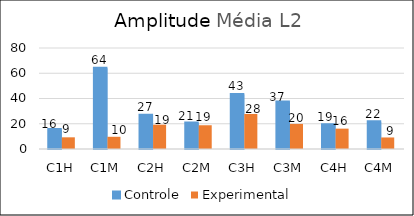
| Category | Controle | Experimental  |
|---|---|---|
| C1H | 15.5 | 9.25 |
| C1M | 64 | 9.675 |
| C2H | 26.75 | 19.25 |
| C2M | 20.5 | 18.812 |
| C3H | 43.25 | 27.75 |
| C3M | 37.25 | 19.875 |
| C4H | 19.25 | 16.125 |
| C4M | 21.5 | 9.138 |